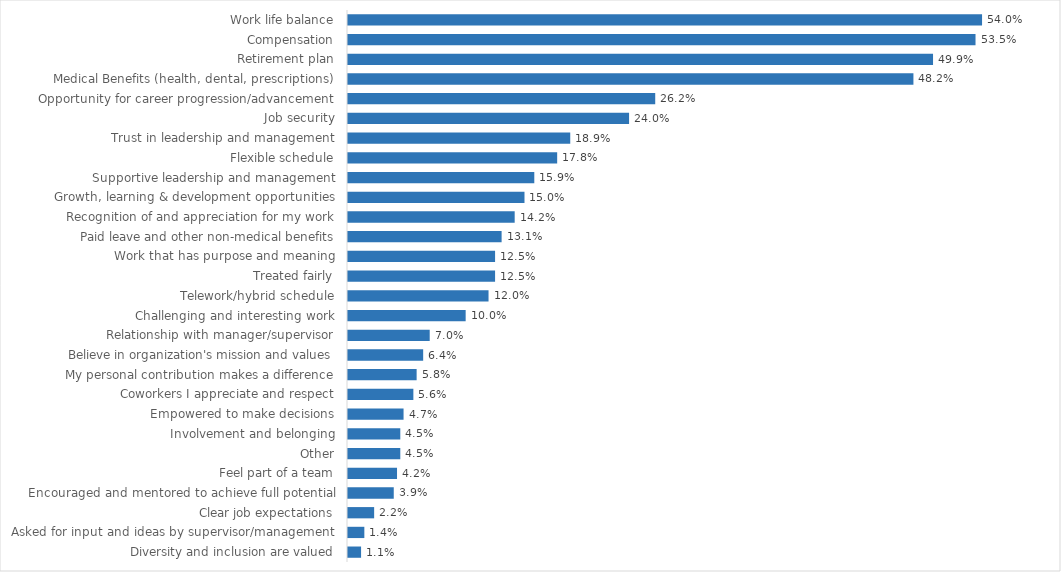
| Category | Corrections |
|---|---|
| Work life balance | 0.54 |
| Compensation | 0.535 |
| Retirement plan | 0.499 |
| Medical Benefits (health, dental, prescriptions) | 0.482 |
| Opportunity for career progression/advancement | 0.262 |
| Job security | 0.24 |
| Trust in leadership and management | 0.189 |
| Flexible schedule | 0.178 |
| Supportive leadership and management | 0.159 |
| Growth, learning & development opportunities | 0.15 |
| Recognition of and appreciation for my work | 0.142 |
| Paid leave and other non-medical benefits | 0.131 |
| Work that has purpose and meaning | 0.125 |
| Treated fairly | 0.125 |
| Telework/hybrid schedule | 0.12 |
| Challenging and interesting work | 0.1 |
| Relationship with manager/supervisor | 0.07 |
| Believe in organization's mission and values | 0.064 |
| My personal contribution makes a difference | 0.058 |
| Coworkers I appreciate and respect | 0.056 |
| Empowered to make decisions | 0.047 |
| Involvement and belonging | 0.045 |
| Other | 0.045 |
| Feel part of a team | 0.042 |
| Encouraged and mentored to achieve full potential | 0.039 |
| Clear job expectations | 0.022 |
| Asked for input and ideas by supervisor/management | 0.014 |
| Diversity and inclusion are valued | 0.011 |